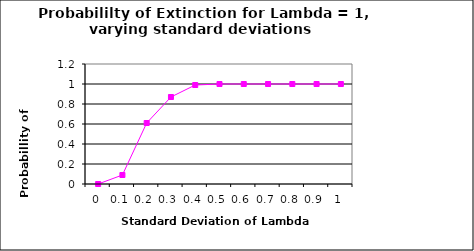
| Category | p(extinction) |
|---|---|
| 0.0 | 0 |
| 0.1 | 0.09 |
| 0.2 | 0.61 |
| 0.3 | 0.87 |
| 0.4 | 0.99 |
| 0.5 | 1 |
| 0.6 | 1 |
| 0.7 | 1 |
| 0.8 | 1 |
| 0.9 | 1 |
| 1.0 | 1 |